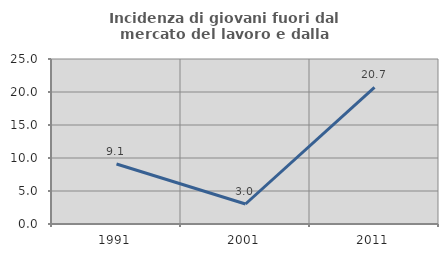
| Category | Incidenza di giovani fuori dal mercato del lavoro e dalla formazione  |
|---|---|
| 1991.0 | 9.091 |
| 2001.0 | 3.03 |
| 2011.0 | 20.69 |